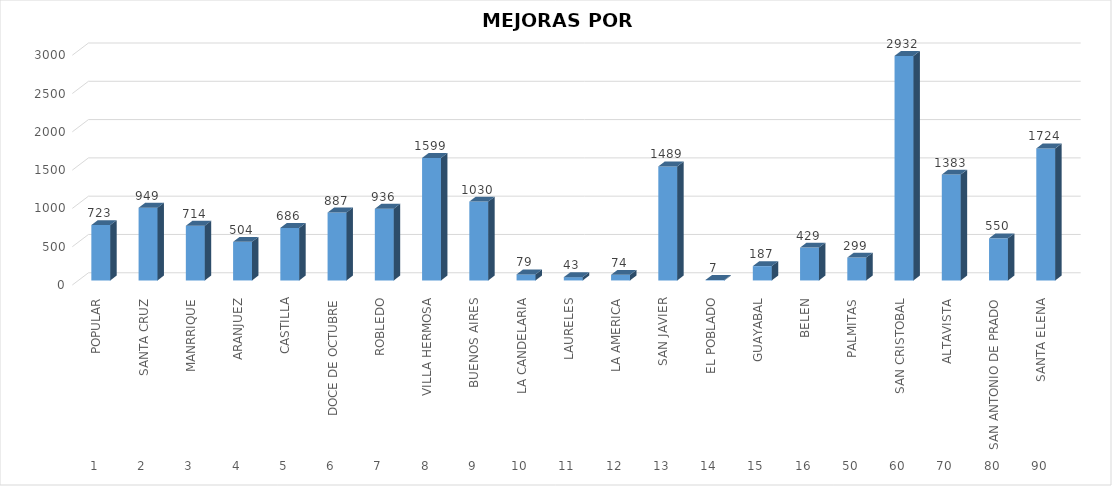
| Category | Mejoras |
|---|---|
| 0 | 723 |
| 1 | 949 |
| 2 | 714 |
| 3 | 504 |
| 4 | 686 |
| 5 | 887 |
| 6 | 936 |
| 7 | 1599 |
| 8 | 1030 |
| 9 | 79 |
| 10 | 43 |
| 11 | 74 |
| 12 | 1489 |
| 13 | 7 |
| 14 | 187 |
| 15 | 429 |
| 16 | 299 |
| 17 | 2932 |
| 18 | 1383 |
| 19 | 550 |
| 20 | 1724 |